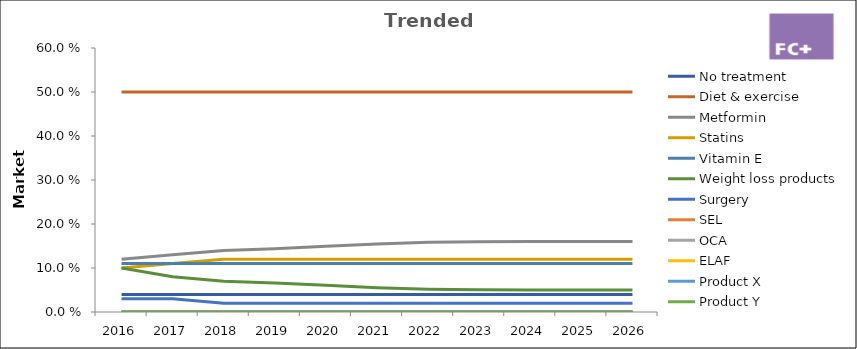
| Category | No treatment | Diet & exercise | Metformin | Statins | Vitamin E | Weight loss products | Surgery | SEL | OCA | ELAF | Product X | Product Y |
|---|---|---|---|---|---|---|---|---|---|---|---|---|
| 2016.0 | 0.04 | 0.5 | 0.12 | 0.1 | 0.11 | 0.1 | 0.03 | 0 | 0 | 0 | 0 | 0 |
| 2017.0 | 0.04 | 0.5 | 0.13 | 0.11 | 0.11 | 0.08 | 0.03 | 0 | 0 | 0 | 0 | 0 |
| 2018.0 | 0.04 | 0.5 | 0.14 | 0.12 | 0.11 | 0.07 | 0.02 | 0 | 0 | 0 | 0 | 0 |
| 2019.0 | 0.04 | 0.5 | 0.144 | 0.12 | 0.11 | 0.066 | 0.02 | 0 | 0 | 0 | 0 | 0 |
| 2020.0 | 0.04 | 0.5 | 0.149 | 0.12 | 0.11 | 0.061 | 0.02 | 0 | 0 | 0 | 0 | 0 |
| 2021.0 | 0.04 | 0.5 | 0.155 | 0.12 | 0.11 | 0.055 | 0.02 | 0 | 0 | 0 | 0 | 0 |
| 2022.0 | 0.04 | 0.5 | 0.158 | 0.12 | 0.11 | 0.052 | 0.02 | 0 | 0 | 0 | 0 | 0 |
| 2023.0 | 0.04 | 0.5 | 0.16 | 0.12 | 0.11 | 0.05 | 0.02 | 0 | 0 | 0 | 0 | 0 |
| 2024.0 | 0.04 | 0.5 | 0.16 | 0.12 | 0.11 | 0.05 | 0.02 | 0 | 0 | 0 | 0 | 0 |
| 2025.0 | 0.04 | 0.5 | 0.16 | 0.12 | 0.11 | 0.05 | 0.02 | 0 | 0 | 0 | 0 | 0 |
| 2026.0 | 0.04 | 0.5 | 0.16 | 0.12 | 0.11 | 0.05 | 0.02 | 0 | 0 | 0 | 0 | 0 |